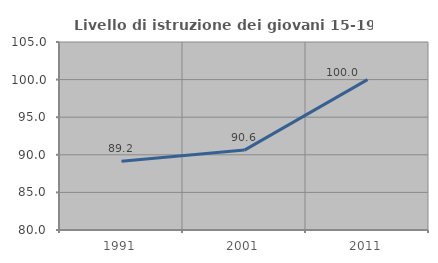
| Category | Livello di istruzione dei giovani 15-19 anni |
|---|---|
| 1991.0 | 89.157 |
| 2001.0 | 90.625 |
| 2011.0 | 100 |